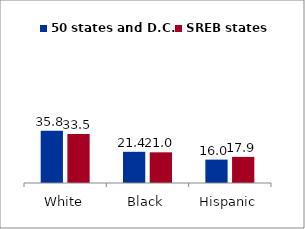
| Category | 50 states and D.C. | SREB states |
|---|---|---|
| White | 35.78 | 33.522 |
| Black | 21.365 | 21.013 |
| Hispanic | 16.014 | 17.883 |